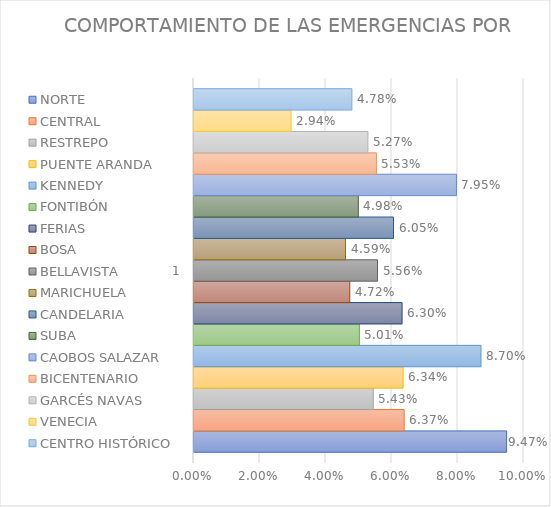
| Category | NORTE | CENTRAL | RESTREPO | PUENTE ARANDA | KENNEDY | FONTIBÓN | FERIAS | BOSA | BELLAVISTA | MARICHUELA | CANDELARIA | SUBA | CAOBOS SALAZAR | BICENTENARIO | GARCÉS NAVAS | VENECIA | CENTRO HISTÓRICO |
|---|---|---|---|---|---|---|---|---|---|---|---|---|---|---|---|---|---|
| 0 | 0.095 | 0.064 | 0.054 | 0.063 | 0.087 | 0.05 | 0.063 | 0.047 | 0.056 | 0.046 | 0.06 | 0.05 | 0.08 | 0.055 | 0.053 | 0.029 | 0.048 |